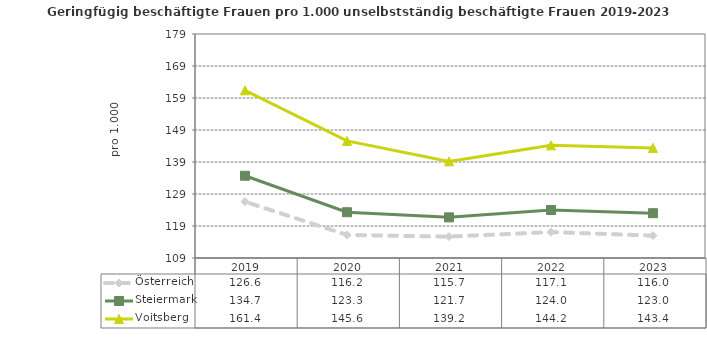
| Category | Österreich | Steiermark | Voitsberg |
|---|---|---|---|
| 2023.0 | 116 | 123 | 143.4 |
| 2022.0 | 117.1 | 124 | 144.2 |
| 2021.0 | 115.7 | 121.7 | 139.2 |
| 2020.0 | 116.2 | 123.3 | 145.6 |
| 2019.0 | 126.6 | 134.7 | 161.4 |